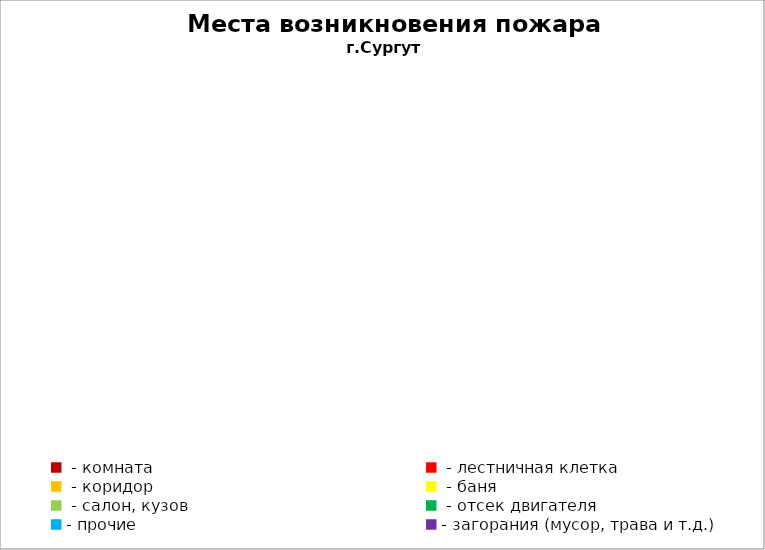
| Category | Места возникновения пожара |
|---|---|
|  - комната | 55 |
|  - лестничная клетка | 14 |
|  - коридор | 11 |
|  - баня | 32 |
|  - салон, кузов | 18 |
|  - отсек двигателя | 38 |
| - прочие | 84 |
| - загорания (мусор, трава и т.д.)  | 145 |